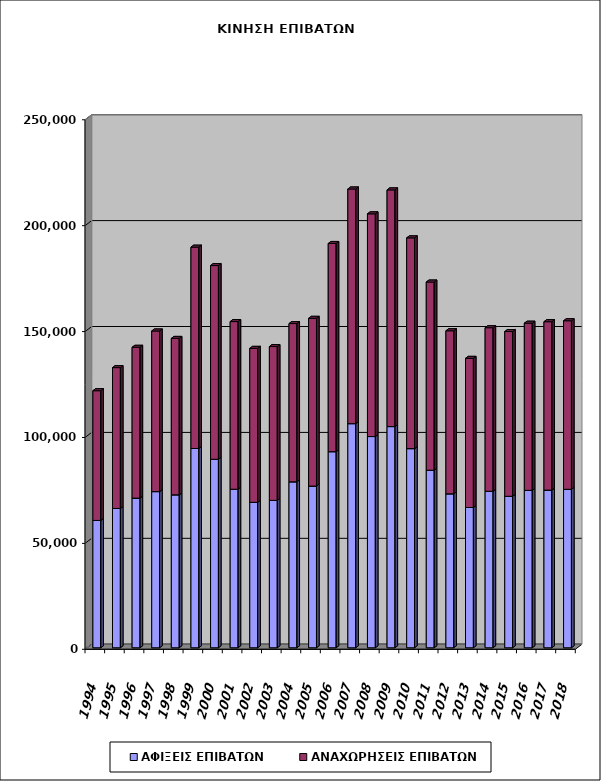
| Category | ΑΦΙΞΕΙΣ ΕΠΙΒΑΤΩΝ | ΑΝΑΧΩΡΗΣΕΙΣ ΕΠΙΒΑΤΩΝ |
|---|---|---|
| 1994.0 | 60122 | 61248 |
| 1995.0 | 65769 | 66500 |
| 1996.0 | 70656 | 71208 |
| 1997.0 | 73734 | 75830 |
| 1998.0 | 72216 | 73840 |
| 1999.0 | 94085 | 95047 |
| 2000.0 | 88999 | 91447 |
| 2001.0 | 74864 | 79140 |
| 2002.0 | 68674 | 72688 |
| 2003.0 | 69584 | 72628 |
| 2004.0 | 78360 | 74707 |
| 2005.0 | 76355 | 79179 |
| 2006.0 | 92586 | 98293 |
| 2007.0 | 105823 | 110782 |
| 2008.0 | 99732 | 105141 |
| 2009.0 | 104440 | 111734 |
| 2010.0 | 94025 | 99505 |
| 2011.0 | 83834 | 88838 |
| 2012.0 | 72686 | 76978 |
| 2013.0 | 66230 | 70411 |
| 2014.0 | 73886 | 77221 |
| 2015.0 | 71520 | 77782 |
| 2016.0 | 74314 | 78926 |
| 2017.0 | 74434 | 79519 |
| 2018.0 | 74825 | 79572 |